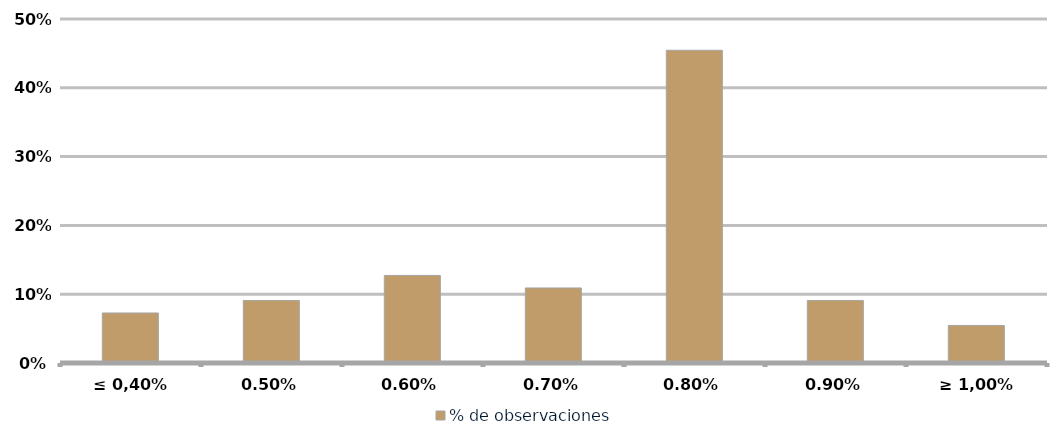
| Category | % de observaciones  |
|---|---|
| ≤ 0,40% | 0.073 |
| 0,50% | 0.091 |
| 0,60% | 0.127 |
| 0,70% | 0.109 |
| 0,80% | 0.455 |
| 0,90% | 0.091 |
| ≥ 1,00% | 0.055 |